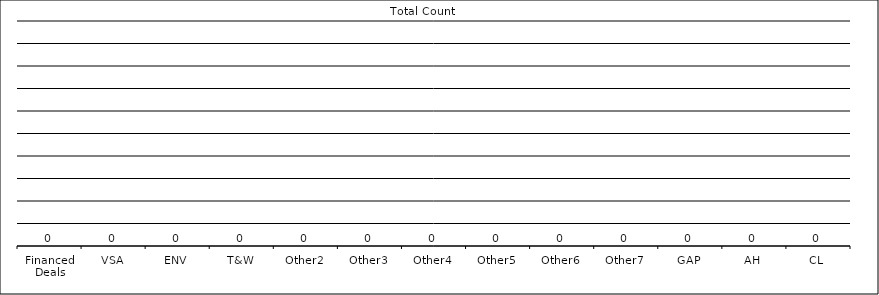
| Category | Product Count |
|---|---|
| Financed Deals | 0 |
| VSA | 0 |
| ENV | 0 |
| T&W | 0 |
| Other2 | 0 |
| Other3 | 0 |
| Other4 | 0 |
| Other5 | 0 |
| Other6 | 0 |
| Other7 | 0 |
| GAP | 0 |
| AH | 0 |
| CL | 0 |